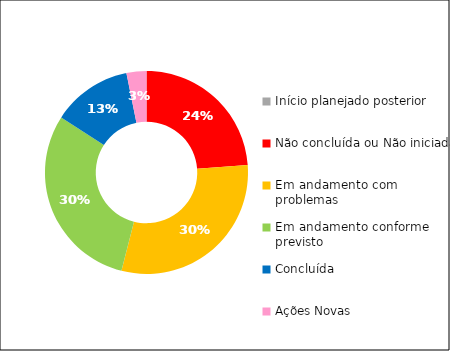
| Category | Series 0 |
|---|---|
| Início planejado posterior | 0 |
| Não concluída ou Não iniciada | 15 |
| Em andamento com problemas | 19 |
| Em andamento conforme previsto | 19 |
| Concluída | 8 |
| Ações Novas | 2 |